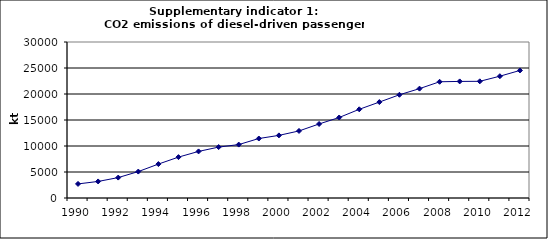
| Category | CO2 emissions of diesel-driven passenger cars, kt |
|---|---|
| 1990 | 2708.953 |
| 1991 | 3183.608 |
| 1992 | 3925.978 |
| 1993 | 5082.366 |
| 1994 | 6522.799 |
| 1995 | 7862.25 |
| 1996 | 8959.13 |
| 1997 | 9791.003 |
| 1998 | 10273.1 |
| 1999 | 11436.504 |
| 2000 | 12043.241 |
| 2001 | 12894.404 |
| 2002 | 14233.802 |
| 2003 | 15481.207 |
| 2004 | 17057.054 |
| 2005 | 18445.58 |
| 2006 | 19850.267 |
| 2007 | 21030.921 |
| 2008 | 22350.086 |
| 2009 | 22420.374 |
| 2010 | 22439.426 |
| 2011 | 23424.638 |
| 2012 | 24530.974 |